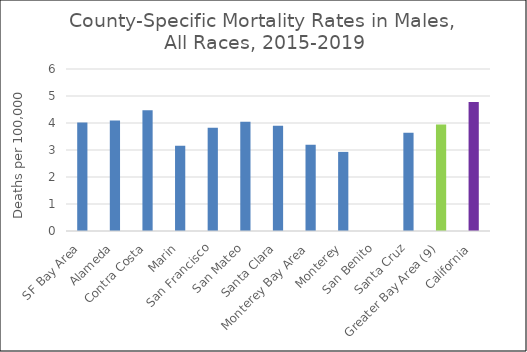
| Category | Male |
|---|---|
| SF Bay Area | 4.02 |
|   Alameda | 4.09 |
|   Contra Costa | 4.47 |
|   Marin | 3.16 |
|   San Francisco | 3.82 |
|   San Mateo | 4.05 |
|   Santa Clara | 3.9 |
| Monterey Bay Area | 3.19 |
|   Monterey | 2.93 |
|   San Benito | 0 |
|   Santa Cruz | 3.64 |
| Greater Bay Area (9) | 3.94 |
| California | 4.78 |